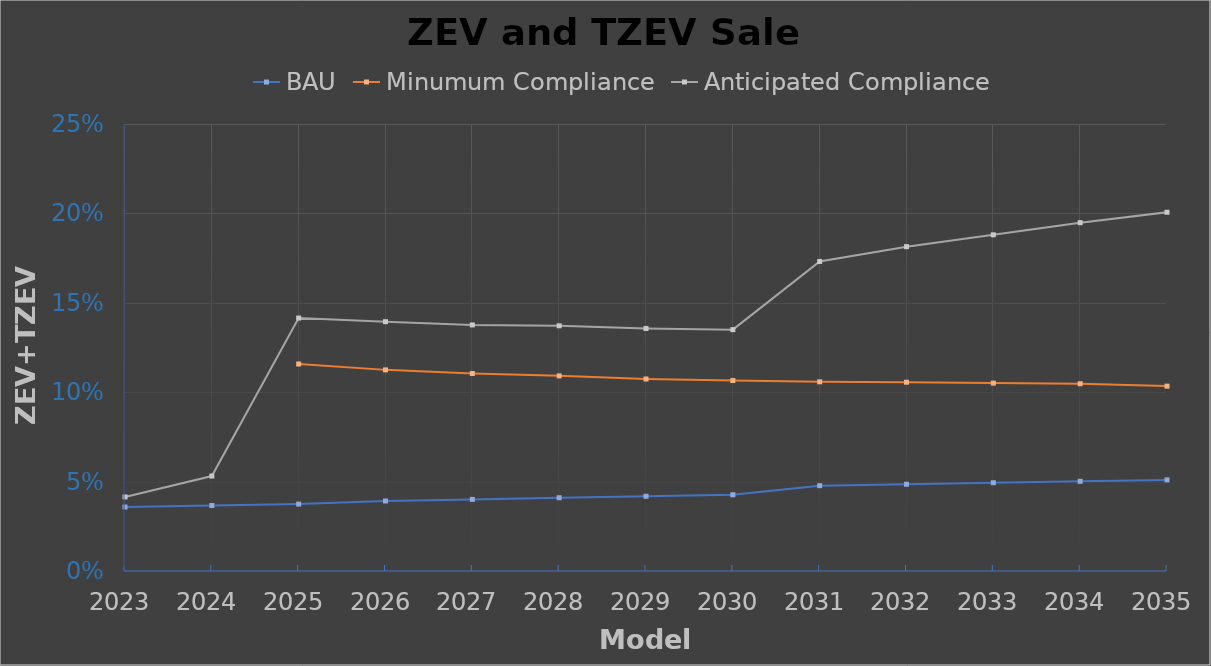
| Category | BAU | Minumum Compliance | Anticipated Compliance |
|---|---|---|---|
| 2023.0 | 0.036 | 0 | 0.041 |
| 2024.0 | 0.037 | 0 | 0.053 |
| 2025.0 | 0.037 | 0.116 | 0.141 |
| 2026.0 | 0.039 | 0.112 | 0.139 |
| 2027.0 | 0.04 | 0.11 | 0.138 |
| 2028.0 | 0.041 | 0.109 | 0.137 |
| 2029.0 | 0.042 | 0.107 | 0.136 |
| 2030.0 | 0.043 | 0.107 | 0.135 |
| 2031.0 | 0.048 | 0.106 | 0.173 |
| 2032.0 | 0.049 | 0.106 | 0.181 |
| 2033.0 | 0.049 | 0.105 | 0.188 |
| 2034.0 | 0.05 | 0.105 | 0.195 |
| 2035.0 | 0.051 | 0.103 | 0.201 |